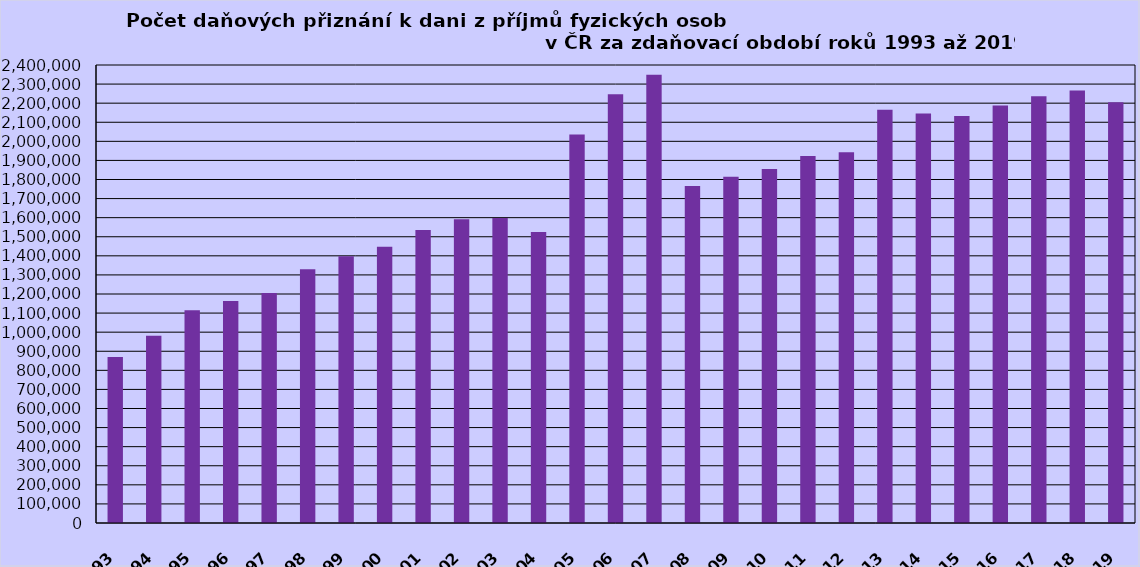
| Category | Series 0 |
|---|---|
| 1993 | 870485 |
| 1994 | 981759 |
| 1995 | 1115081 |
| 1996 | 1163781 |
| 1997 | 1205802 |
| 1998 | 1330034 |
| 1999 | 1398394 |
| 2000 | 1448084 |
| 2001 | 1535281 |
| 2002 | 1592244 |
| 2003 | 1598164 |
| 2004 | 1524649 |
| *2005 | 2036101 |
| 2006 | 2246839 |
| 2007 | 2348299 |
| 2008 | 1766154 |
| 2009 | 1814116 |
| 2010 | 1855006 |
| 2011 | 1923072 |
| 2012 | 1943148 |
| 2013 | 2165474 |
| 2014 | 2146372 |
| 2015 | 2132472 |
| 2016 | 2187512 |
| 2017 | 2235848 |
| 2018 | 2266727 |
| 2019 | 2204979 |